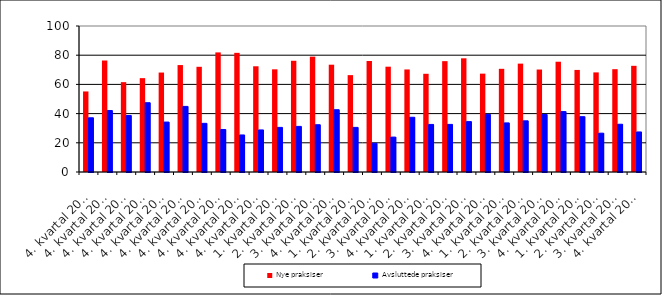
| Category | Nye praksiser | Avsluttede |
|---|---|---|
| 4. kvartal 2001 | 55.172 | 37.143 |
| 4. kvartal 2002 | 76.364 | 42.105 |
| 4. kvartal 2003 | 61.538 | 38.71 |
| 4. kvartal 2004 | 64.286 | 47.458 |
| 4. kvartal 2005 | 68.116 | 34.211 |
| 4. kvartal 2010 | 73.239 | 44.928 |
| 4. kvartal 2011 | 72.059 | 33.333 |
| 4. kvartal 2012 | 81.915 | 29.114 |
| 4. kvartal 2013 | 81.609 | 25.373 |
| 4. kvartal 2014 | 72.414 | 28.814 |
| 1. kvartal 2015 | 70.33 | 30.556 |
| 2. kvartal 2015 | 76.19 | 31.25 |
| 3. kvartal 2015 | 79 | 32.381 |
| 4. kvartal 2015 | 73.494 | 42.667 |
| 1. kvartal 2016 | 66.346 | 30.556 |
| 2. kvartal 2016 | 76.042 | 19.672 |
| 3. kvartal 2016 | 72.131 | 23.913 |
| 4. kvartal 2016 | 70.238 | 37.5 |
| 1. kvartal 2017 | 67.273 | 32.584 |
| 2. kvartal 2017 | 75.926 | 32.609 |
| 3. kvartal 2017 | 77.869 | 34.524 |
| 4. kvartal 2017 | 67.368 | 39.474 |
| 1. kvartal 2018 | 70.677 | 33.628 |
| 2. kvartal 2018 | 74.227 | 35.052 |
| 3. kvartal 2018 | 70.186 | 39.394 |
| 4. kvartal 2018 | 75.532 | 41.379 |
| 1. kvartal 2019 | 69.912 | 37.895 |
| 2. kvartal 2019 | 68.224 | 26.596 |
| 3. kvartal 2019 | 70.423 | 32.716 |
| 4. kvartal 2019 | 72.727 | 27.434 |